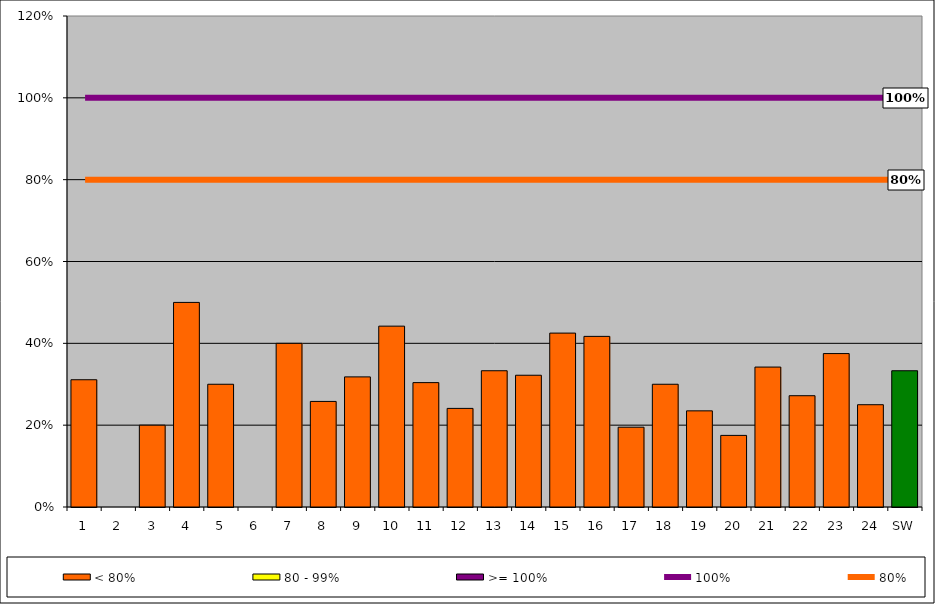
| Category | < 80% | 80 - 99% | >= 100% |
|---|---|---|---|
| 1 | 0.311 | 0 | 0 |
| 2 | 0 | 0 | 0 |
| 3 | 0.2 | 0 | 0 |
| 4 | 0.5 | 0 | 0 |
| 5 | 0.3 | 0 | 0 |
| 6 | 0 | 0 | 0 |
| 7 | 0.4 | 0 | 0 |
| 8 | 0.258 | 0 | 0 |
| 9 | 0.318 | 0 | 0 |
| 10 | 0.442 | 0 | 0 |
| 11 | 0.304 | 0 | 0 |
| 12 | 0.241 | 0 | 0 |
| 13 | 0.333 | 0 | 0 |
| 14 | 0.322 | 0 | 0 |
| 15 | 0.425 | 0 | 0 |
| 16 | 0.417 | 0 | 0 |
| 17 | 0.195 | 0 | 0 |
| 18 | 0.3 | 0 | 0 |
| 19 | 0.235 | 0 | 0 |
| 20 | 0.175 | 0 | 0 |
| 21 | 0.342 | 0 | 0 |
| 22 | 0.272 | 0 | 0 |
| 23 | 0.375 | 0 | 0 |
| 24 | 0.25 | 0 | 0 |
| SW | 0.333 | 0 | 0 |